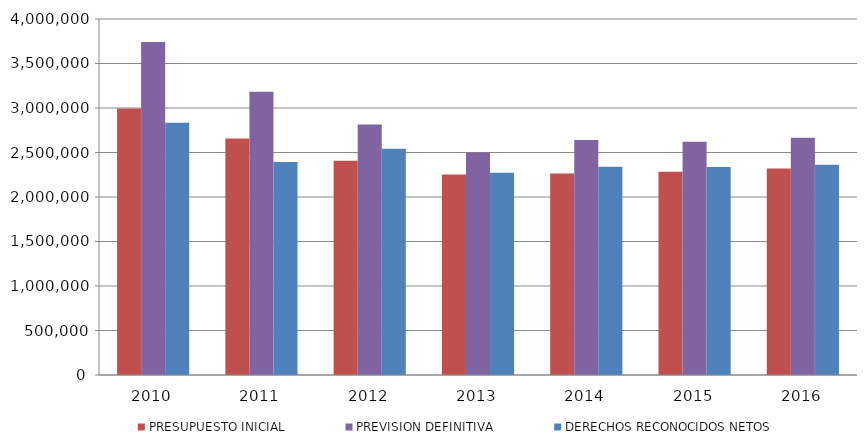
| Category | PRESUPUESTO INICIAL | PREVISION DEFINITIVA | DERECHOS RECONOCIDOS NETOS |
|---|---|---|---|
| 2010.0 | 2993809.334 | 3741837.64 | 2833638.064 |
| 2011.0 | 2658404.732 | 3183967.276 | 2392480.632 |
| 2012.0 | 2407218.064 | 2813727.777 | 2542189.167 |
| 2013.0 | 2251494.132 | 2500420.555 | 2272108.92 |
| 2014.0 | 2262738.711 | 2640789.018 | 2338899.754 |
| 2015.0 | 2283050.748 | 2620836.624 | 2337248.453 |
| 2016.0 | 2319746.35 | 2666994.471 | 2363332.172 |